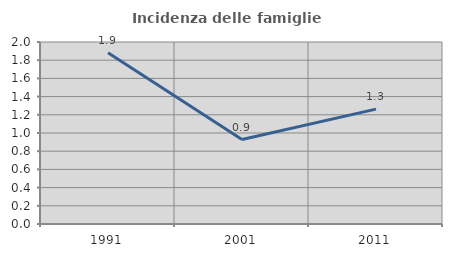
| Category | Incidenza delle famiglie numerose |
|---|---|
| 1991.0 | 1.881 |
| 2001.0 | 0.928 |
| 2011.0 | 1.262 |